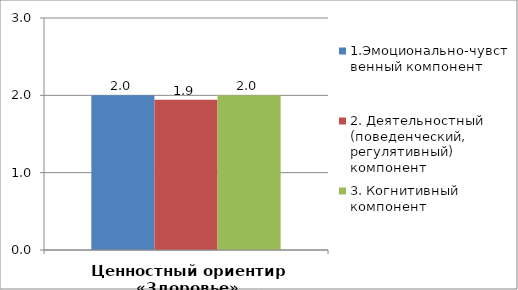
| Category | 1.Эмоционально-чувственный компонент | 2. Деятельностный (поведенческий, регулятивный) компонент | 3. Когнитивный компонент |
|---|---|---|---|
| Ценностный ориентир «Здоровье» | 2 | 1.944 | 2 |